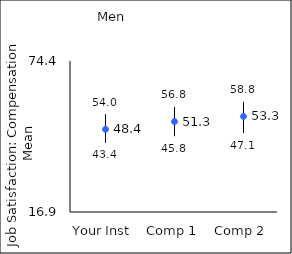
| Category | 25th percentile | 75th percentile | Mean |
|---|---|---|---|
| Your Inst | 43.4 | 54 | 48.4 |
| Comp 1 | 45.8 | 56.8 | 51.34 |
| Comp 2 | 47.1 | 58.8 | 53.29 |